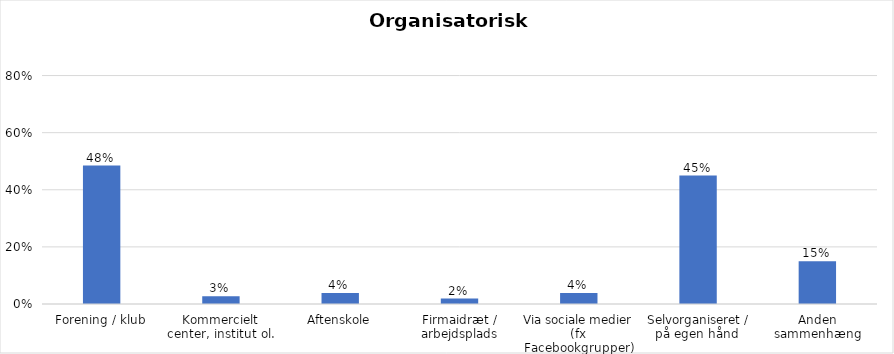
| Category | % |
|---|---|
| Forening / klub | 0.485 |
| Kommercielt center, institut ol. | 0.027 |
| Aftenskole | 0.038 |
| Firmaidræt / arbejdsplads | 0.019 |
| Via sociale medier (fx Facebookgrupper) | 0.038 |
| Selvorganiseret / på egen hånd  | 0.45 |
| Anden sammenhæng | 0.15 |